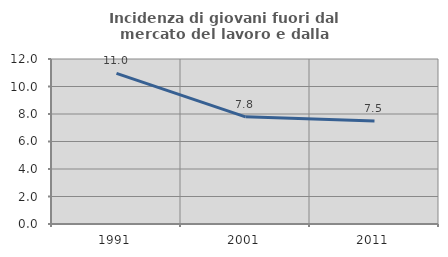
| Category | Incidenza di giovani fuori dal mercato del lavoro e dalla formazione  |
|---|---|
| 1991.0 | 10.951 |
| 2001.0 | 7.796 |
| 2011.0 | 7.496 |